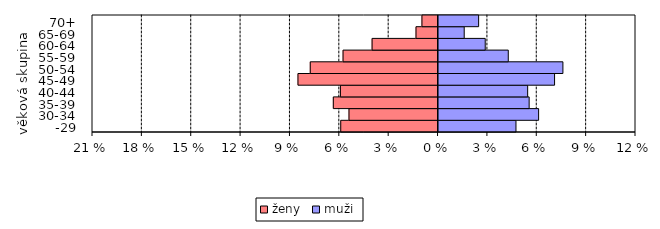
| Category | ženy | muži |
|---|---|---|
| -29 | -5.914 | 4.767 |
| 30-34 | -5.412 | 6.142 |
| 35-39 | -6.365 | 5.567 |
| 40-44 | -5.934 | 5.477 |
| 45-49 | -8.513 | 7.112 |
| 50-54 | -7.766 | 7.619 |
| 55-59 | -5.773 | 4.299 |
| 60-64 | -4.008 | 2.898 |
| 65-69 | -1.339 | 1.621 |
|  70+ | -0.978 | 2.497 |